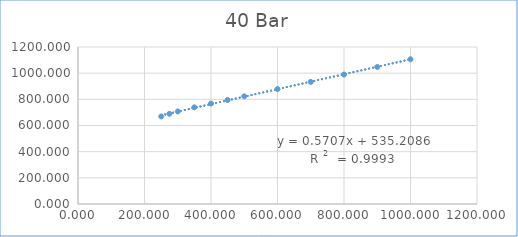
| Category | Series 0 |
|---|---|
| 250.4 | 669.087 |
| 275.0 | 689.752 |
| 300.0 | 707.525 |
| 350.0 | 738.963 |
| 400.0 | 767.917 |
| 450.0 | 795.796 |
| 500.0 | 823.22 |
| 600.0 | 877.903 |
| 700.0 | 933.182 |
| 800.0 | 989.56 |
| 900.0 | 1047.277 |
| 1000.0 | 1106.355 |